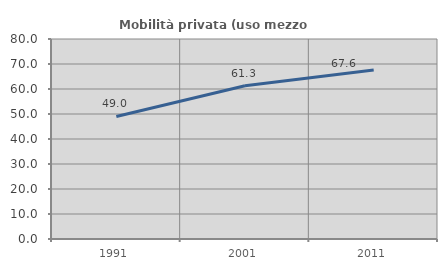
| Category | Mobilità privata (uso mezzo privato) |
|---|---|
| 1991.0 | 49.03 |
| 2001.0 | 61.293 |
| 2011.0 | 67.586 |